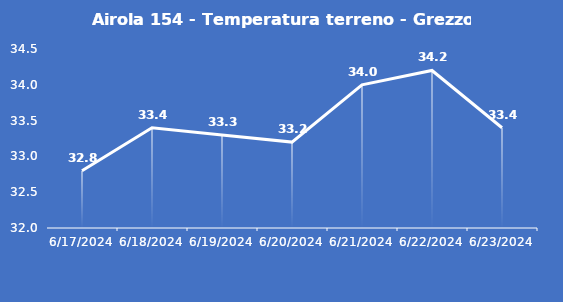
| Category | Airola 154 - Temperatura terreno - Grezzo (°C) |
|---|---|
| 6/17/24 | 32.8 |
| 6/18/24 | 33.4 |
| 6/19/24 | 33.3 |
| 6/20/24 | 33.2 |
| 6/21/24 | 34 |
| 6/22/24 | 34.2 |
| 6/23/24 | 33.4 |